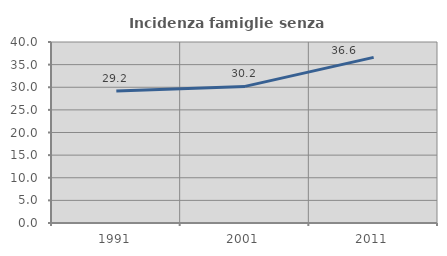
| Category | Incidenza famiglie senza nuclei |
|---|---|
| 1991.0 | 29.179 |
| 2001.0 | 30.189 |
| 2011.0 | 36.61 |